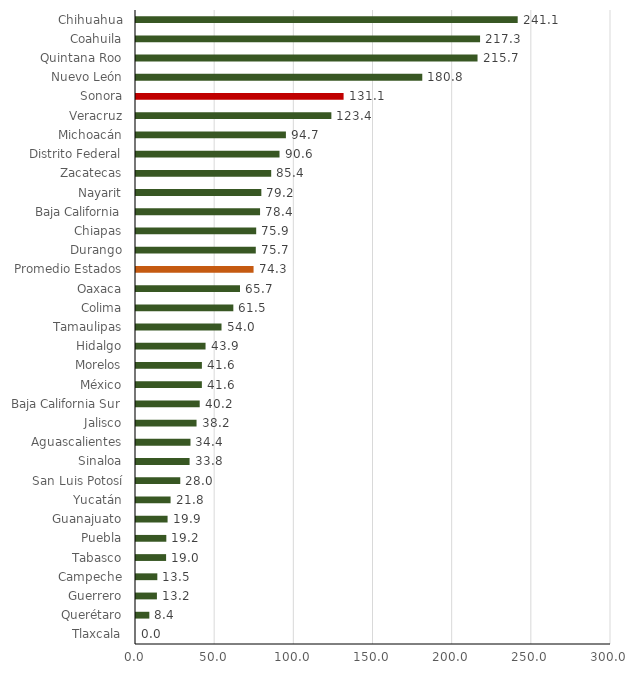
| Category | Proporción Deuda de Participaciones |
|---|---|
| Tlaxcala | 0 |
| Querétaro | 8.421 |
| Guerrero | 13.215 |
| Campeche | 13.469 |
| Tabasco | 19.011 |
| Puebla | 19.151 |
| Guanajuato | 19.947 |
| Yucatán | 21.838 |
| San Luis Potosí | 27.957 |
| Sinaloa | 33.844 |
| Aguascalientes | 34.409 |
| Jalisco | 38.238 |
| Baja California Sur | 40.236 |
| México | 41.599 |
| Morelos | 41.619 |
| Hidalgo | 43.923 |
| Tamaulipas | 54.011 |
| Colima | 61.476 |
| Oaxaca | 65.684 |
| Promedio Estados | 74.251 |
| Durango | 75.661 |
| Chiapas | 75.915 |
| Baja California | 78.352 |
| Nayarit | 79.163 |
| Zacatecas | 85.391 |
| Distrito Federal | 90.64 |
| Michoacán | 94.678 |
| Veracruz | 123.39 |
| Sonora | 131.112 |
| Nuevo León | 180.804 |
| Quintana Roo | 215.707 |
| Coahuila | 217.305 |
| Chihuahua | 241.071 |